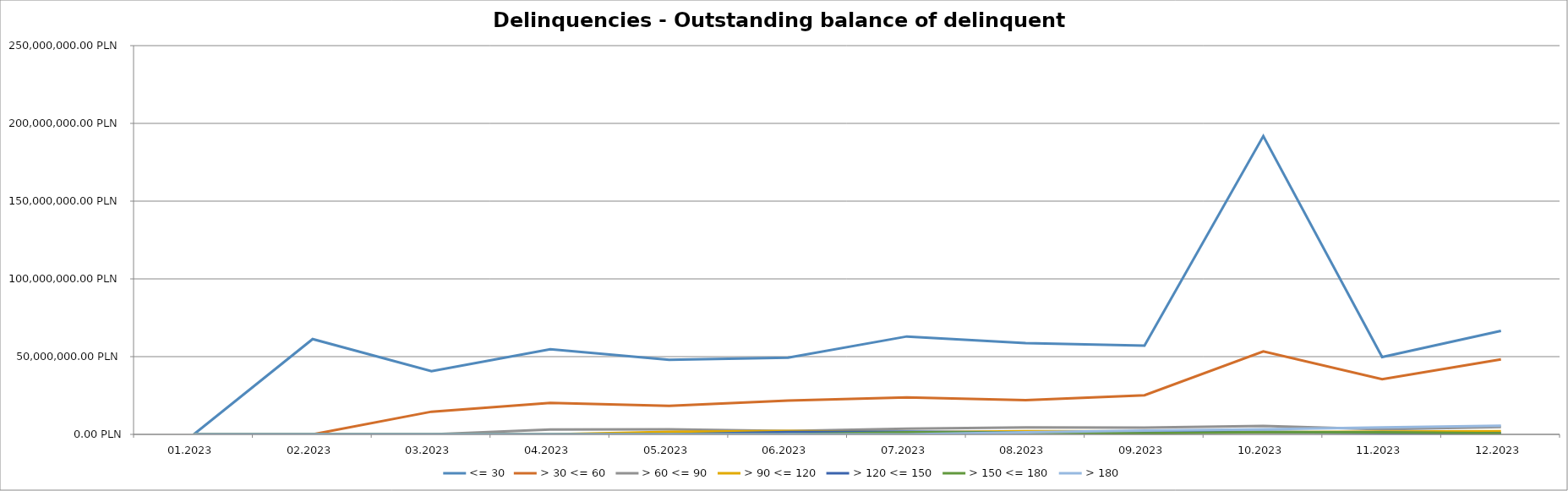
| Category | <= 30 | > 30 <= 60 | > 60 <= 90 | > 90 <= 120 | > 120 <= 150 | > 150 <= 180 | > 180 |
|---|---|---|---|---|---|---|---|
| 01.2023 | 0 | 0 | 0 | 0 | 0 | 0 | 0 |
| 02.2023 | 61279332.52 | 0 | 0 | 0 | 0 | 0 | 0 |
| 03.2023 | 40663789.15 | 14592814.21 | 0 | 0 | 0 | 0 | 0 |
| 04.2023 | 54729258.98 | 20207986.71 | 3105470.81 | 0 | 0 | 0 | 0 |
| 05.2023 | 47980491.52 | 18365026.23 | 3236930.39 | 1575049.71 | 0 | 0 | 0 |
| 06.2023 | 49274463.43 | 21757116.33 | 2145346.9 | 2234258.08 | 1546159.58 | 0 | 0 |
| 07.2023 | 62971390.96 | 23765504.45 | 3638339.96 | 1315739.52 | 1741228.92 | 1367122.32 | 0 |
| 08.2023 | 58667444.31 | 21958530.42 | 4534282.61 | 1998402.31 | 1197894.69 | 1186456.03 | 1367122.32 |
| 09.2023 | 57013090.09 | 25164417.49 | 4339269.75 | 1883194.82 | 1723494.5 | 705526.9 | 2508053.04 |
| 10.2023 | 191776280.48 | 53378945.55 | 5393392.38 | 1354505.77 | 1667300.89 | 1446484.43 | 3213579.94 |
| 11.2023 | 49723312.18 | 35482092.6 | 3276474.02 | 1813628.1 | 960023.75 | 1340003.09 | 4479480.65 |
| 12.2023 | 66557683.94 | 48283270.27 | 4762291.3 | 2048088.54 | 703260.31 | 730995.54 | 5619137.42 |